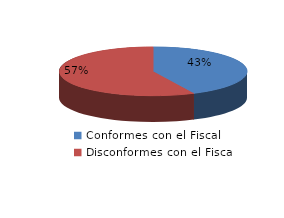
| Category | Series 0 |
|---|---|
| 0 | 12 |
| 1 | 16 |